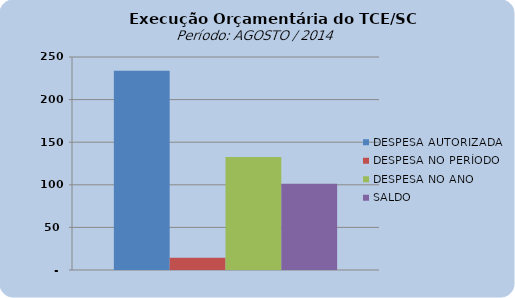
| Category | DESPESA AUTORIZADA | DESPESA NO PERÍODO | DESPESA NO ANO | SALDO |
|---|---|---|---|---|
| 0 | 233732560.43 | 14387510.41 | 132619874.46 | 101112685.97 |